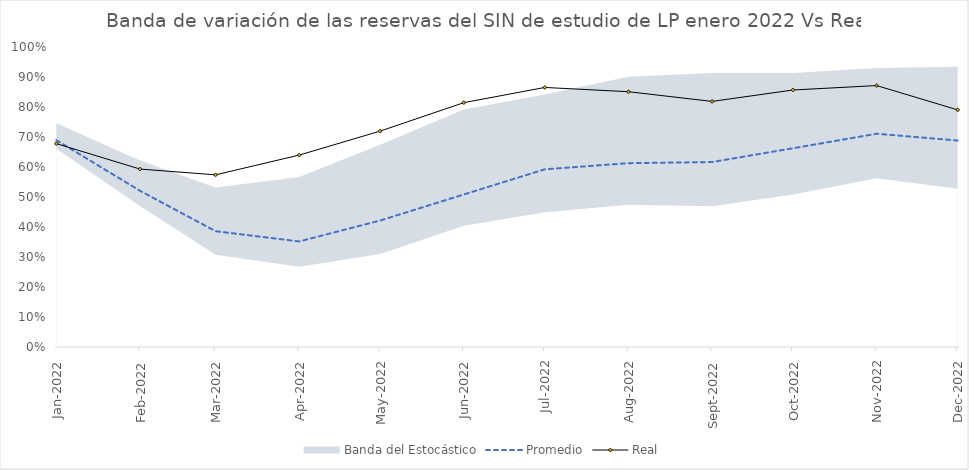
| Category | Promedio | Real |
|---|---|---|
| 2022-01-01 | 0.69 | 0.678 |
| 2022-02-01 | 0.521 | 0.593 |
| 2022-03-01 | 0.386 | 0.574 |
| 2022-04-01 | 0.352 | 0.64 |
| 2022-05-01 | 0.422 | 0.72 |
| 2022-06-01 | 0.508 | 0.814 |
| 2022-07-01 | 0.592 | 0.865 |
| 2022-08-01 | 0.613 | 0.851 |
| 2022-09-01 | 0.617 | 0.819 |
| 2022-10-01 | 0.663 | 0.857 |
| 2022-11-01 | 0.711 | 0.871 |
| 2022-12-01 | 0.688 | 0.79 |